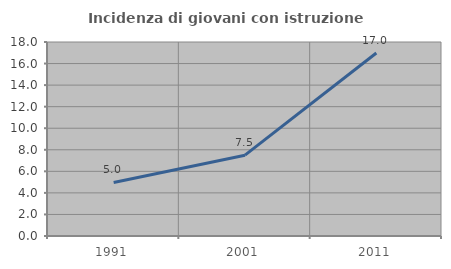
| Category | Incidenza di giovani con istruzione universitaria |
|---|---|
| 1991.0 | 4.97 |
| 2001.0 | 7.5 |
| 2011.0 | 16.981 |